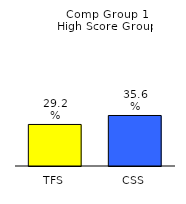
| Category | Series 0 |
|---|---|
| TFS | 0.292 |
| CSS | 0.356 |